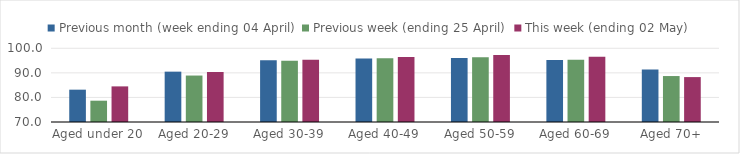
| Category | Previous month (week ending 04 April) | Previous week (ending 25 April) | This week (ending 02 May) |
|---|---|---|---|
| Aged under 20 | 83.156 | 78.671 | 84.493 |
| Aged 20-29 | 90.492 | 88.906 | 90.352 |
| Aged 30-39 | 95.129 | 94.909 | 95.312 |
| Aged 40-49 | 95.803 | 95.899 | 96.428 |
| Aged 50-59 | 96.056 | 96.372 | 97.298 |
| Aged 60-69 | 95.253 | 95.308 | 96.528 |
| Aged 70+ | 91.393 | 88.704 | 88.278 |